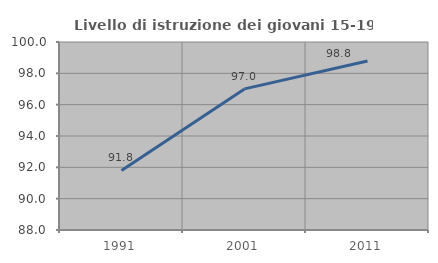
| Category | Livello di istruzione dei giovani 15-19 anni |
|---|---|
| 1991.0 | 91.805 |
| 2001.0 | 97.007 |
| 2011.0 | 98.788 |